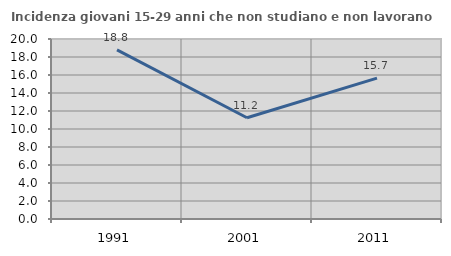
| Category | Incidenza giovani 15-29 anni che non studiano e non lavorano  |
|---|---|
| 1991.0 | 18.795 |
| 2001.0 | 11.248 |
| 2011.0 | 15.656 |